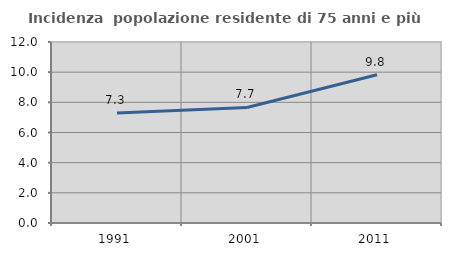
| Category | Incidenza  popolazione residente di 75 anni e più |
|---|---|
| 1991.0 | 7.288 |
| 2001.0 | 7.659 |
| 2011.0 | 9.824 |